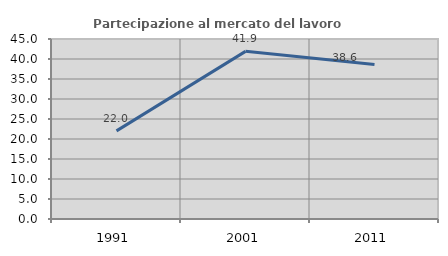
| Category | Partecipazione al mercato del lavoro  femminile |
|---|---|
| 1991.0 | 22.025 |
| 2001.0 | 41.91 |
| 2011.0 | 38.601 |